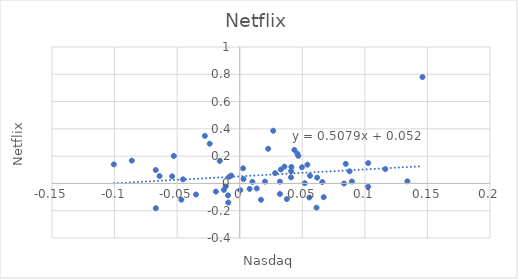
| Category | Rnflx |
|---|---|
| 0.026774330641733846 | 0.386 |
| -0.011175496688741737 | -0.022 |
| 0.04604437002930095 | 0.218 |
| 0.1460584233693476 | 0.78 |
| 0.10265363128491622 | 0.149 |
| 0.013616212792906701 | -0.037 |
| -0.08622305529522023 | 0.167 |
| 0.06188034188034197 | 0.043 |
| 0.06600128783000625 | 0.01 |
| 0.0027182120205377913 | 0.111 |
| -0.10060240963855416 | 0.14 |
| 0.0847287340924312 | 0.143 |
| 0.0896881753627663 | 0.014 |
| 0.11630542569769076 | 0.105 |
| 0.010152284263959643 | 0.012 |
| -0.06708542713567844 | 0.098 |
| 0.0328575276057097 | 0.102 |
| -0.06701434159061281 | -0.182 |
| 0.03214086081609824 | -0.077 |
| 0.022745735174654946 | 0.254 |
| 0.0413026211278793 | 0.121 |
| 0.06712433257055661 | -0.101 |
| 0.03573981415296634 | 0.123 |
| -0.03496664366229574 | -0.081 |
| 0.0376638855780691 | -0.115 |
| 0.016999770273374626 | -0.12 |
| 0.083352157217077 | -0.001 |
| -0.023978315262718874 | 0.291 |
| 0.08780175176244387 | 0.089 |
| -0.009131971720345522 | -0.14 |
| -0.027846595976612876 | 0.348 |
| 0.049745158002038714 | 0.118 |
| -0.05399106622645178 | 0.052 |
| 0.04680763703551638 | 0.202 |
| -0.019023337909393923 | -0.06 |
| 0.051979208316673464 | 0.002 |
| 0.13397947548460665 | 0.016 |
| -0.015920898273839357 | 0.165 |
| -0.009366485013624026 | -0.088 |
| 0.06137184115523464 | -0.177 |
| 0.04097829608033687 | 0.045 |
| 0.02831803329702831 | 0.075 |
| -0.046603116961718816 | -0.119 |
| 0.041104586573559754 | 0.09 |
| -0.012652439024390394 | -0.048 |
| 0.10267098965570498 | -0.024 |
| 0.003080369644357317 | 0.032 |
| -0.06407035175879405 | 0.054 |
| -0.05264727815063375 | 0.201 |
| 0.0004722921914357414 | -0.049 |
| 0.056176239181746634 | 0.056 |
| 0.05408224076281276 | 0.137 |
| 0.020212014134275647 | 0.013 |
| -0.04530340814630107 | 0.03 |
| -0.006820490494848341 | 0.057 |
| -0.00832846288720035 | 0.049 |
| 0.05569471047590979 | -0.103 |
| 0.043684577808792646 | 0.245 |
| 0.007889810109654949 | -0.04 |
| 0.032108265888284526 | 0.013 |